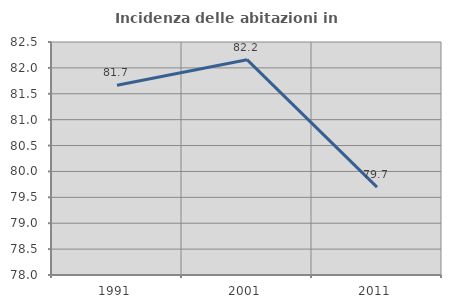
| Category | Incidenza delle abitazioni in proprietà  |
|---|---|
| 1991.0 | 81.665 |
| 2001.0 | 82.158 |
| 2011.0 | 79.698 |